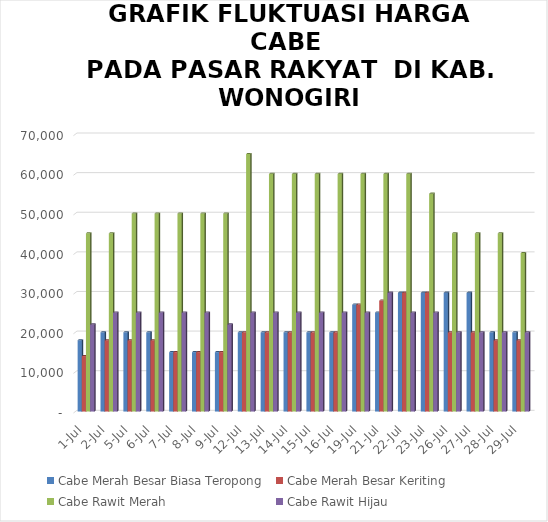
| Category | Cabe Merah Besar Biasa Teropong | Cabe Merah Besar Keriting | Cabe Rawit Merah | Cabe Rawit Hijau |
|---|---|---|---|---|
| 2021-07-01 | 18000 | 14000 | 45000 | 22000 |
| 2021-07-02 | 20000 | 18000 | 45000 | 25000 |
| 2021-07-05 | 20000 | 18000 | 50000 | 25000 |
| 2021-07-06 | 20000 | 18000 | 50000 | 25000 |
| 2021-07-07 | 15000 | 15000 | 50000 | 25000 |
| 2021-07-08 | 15000 | 15000 | 50000 | 25000 |
| 2021-07-09 | 15000 | 15000 | 50000 | 22000 |
| 2021-07-12 | 20000 | 20000 | 65000 | 25000 |
| 2021-07-13 | 20000 | 20000 | 60000 | 25000 |
| 2021-07-14 | 20000 | 20000 | 60000 | 25000 |
| 2021-07-15 | 20000 | 20000 | 60000 | 25000 |
| 2021-07-16 | 20000 | 20000 | 60000 | 25000 |
| 2021-07-19 | 27000 | 27000 | 60000 | 25000 |
| 2021-07-21 | 25000 | 28000 | 60000 | 30000 |
| 2021-07-22 | 30000 | 30000 | 60000 | 25000 |
| 2021-07-23 | 30000 | 30000 | 55000 | 25000 |
| 2021-07-26 | 30000 | 20000 | 45000 | 20000 |
| 2021-07-27 | 30000 | 20000 | 45000 | 20000 |
| 2021-07-28 | 20000 | 18000 | 45000 | 20000 |
| 2021-07-29 | 20000 | 18000 | 40000 | 20000 |